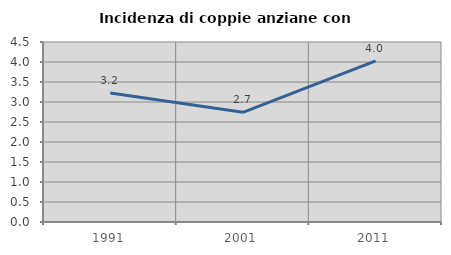
| Category | Incidenza di coppie anziane con figli |
|---|---|
| 1991.0 | 3.226 |
| 2001.0 | 2.743 |
| 2011.0 | 4.029 |